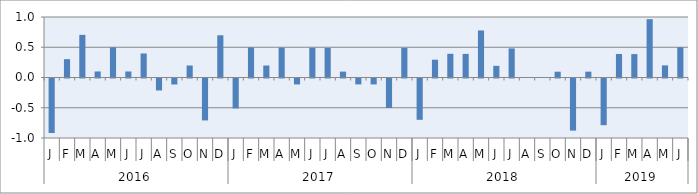
| Category | Series 0 |
|---|---|
| 0 | -0.901 |
| 1 | 0.303 |
| 2 | 0.705 |
| 3 | 0.1 |
| 4 | 0.5 |
| 5 | 0.099 |
| 6 | 0.397 |
| 7 | -0.198 |
| 8 | -0.099 |
| 9 | 0.198 |
| 10 | -0.693 |
| 11 | 0.698 |
| 12 | -0.495 |
| 13 | 0.498 |
| 14 | 0.198 |
| 15 | 0.494 |
| 16 | -0.098 |
| 17 | 0.492 |
| 18 | 0.49 |
| 19 | 0.097 |
| 20 | -0.097 |
| 21 | -0.097 |
| 22 | -0.488 |
| 23 | 0.49 |
| 24 | -0.683 |
| 25 | 0.295 |
| 26 | 0.392 |
| 27 | 0.39 |
| 28 | 0.777 |
| 29 | 0.193 |
| 30 | 0.481 |
| 31 | 0 |
| 32 | 0 |
| 33 | 0.096 |
| 34 | -0.861 |
| 35 | 0.097 |
| 36 | -0.771 |
| 37 | 0.389 |
| 38 | 0.387 |
| 39 | 0.964 |
| 40 | 0.2 |
| 41 | 0.5 |